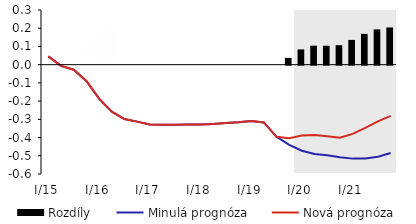
| Category | Rozdíly |
|---|---|
| I/15 | 0 |
| II | 0 |
| III | 0 |
| IV | 0 |
| I/16 | 0 |
| II | 0 |
| III | 0 |
| IV | 0 |
| I/17 | 0 |
| II | 0 |
| III | 0 |
| IV | 0 |
| I/18 | 0 |
| II | 0 |
| III | 0 |
| IV | 0 |
| I/19 | 0 |
| II | 0 |
| III | 0 |
| IV | 0.037 |
| I/20 | 0.084 |
| II | 0.104 |
| III | 0.104 |
| IV | 0.107 |
| I/21 | 0.136 |
| II | 0.169 |
| III | 0.194 |
| IV | 0.204 |